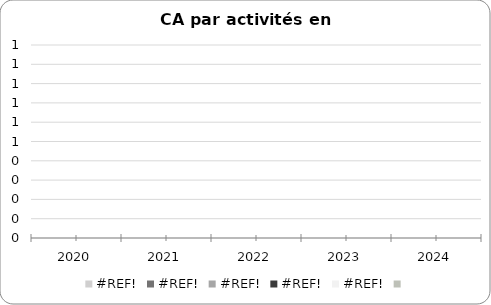
| Category | #REF! | Series 5 |
|---|---|---|
| 2020.0 | 0 |  |
| 2021.0 | 0 |  |
| 2022.0 | 0 |  |
| 2023.0 | 0 |  |
| 2024.0 | 0 |  |